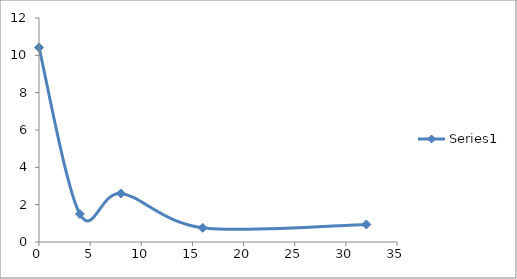
| Category | Series 0 |
|---|---|
| 0.0 | 10.42 |
| 4.0 | 1.5 |
| 8.0 | 2.6 |
| 16.0 | 0.76 |
| 32.0 | 0.94 |